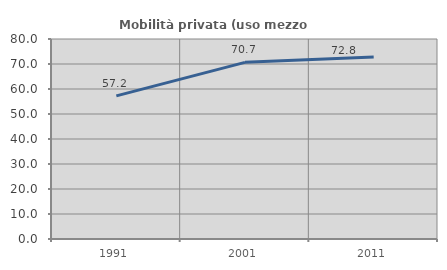
| Category | Mobilità privata (uso mezzo privato) |
|---|---|
| 1991.0 | 57.246 |
| 2001.0 | 70.662 |
| 2011.0 | 72.792 |